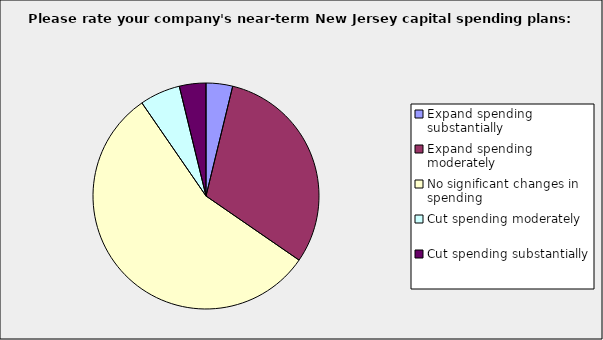
| Category | Series 0 |
|---|---|
| Expand spending substantially | 0.038 |
| Expand spending moderately | 0.308 |
| No significant changes in spending | 0.558 |
| Cut spending moderately | 0.058 |
| Cut spending substantially | 0.038 |